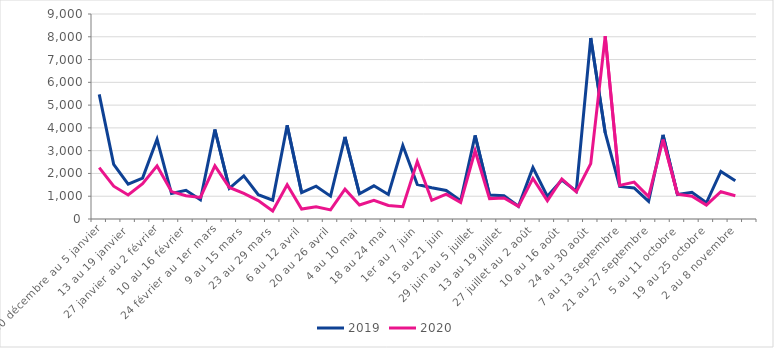
| Category | 2019 | 2020 |
|---|---|---|
| 30 décembre au 5 janvier | 5469 | 2256 |
| 6 au 12 janvier | 2401 | 1441 |
| 13 au 19 janvier | 1528 | 1054 |
| 20 au 26 janvier | 1797 | 1554 |
| 27 janvier au 2 février | 3500 | 2331 |
| 3 au 9 février | 1116 | 1204 |
| 10 au 16 février | 1260 | 1022 |
| 17 au 23 février | 842 | 948 |
| 24 février au 1er mars | 3929 | 2335 |
| 2 au 8 mars | 1349 | 1386 |
| 9 au 15 mars | 1894 | 1122 |
| 16 au 22 mars | 1068 | 810 |
| 23 au 29 mars | 828 | 352 |
| 30 mars au 5 avril | 4112 | 1501 |
| 6 au 12 avril | 1157 | 438 |
| 13 au 19 avril | 1441 | 540 |
| 20 au 26 avril | 1004 | 399 |
| 27 avril au 3 mai | 3605 | 1312 |
| 4 au 10 mai | 1107 | 617 |
| 11 au 17 mai | 1456 | 817 |
| 18 au 24 mai | 1077 | 597 |
| 25 au 31 mai | 3223 | 539 |
| 1er au 7 juin | 1515 | 2523 |
| 8 au 14 juin | 1371 | 819 |
| 15 au 21 juin | 1250 | 1088 |
| 22 au 28 juin | 799 | 721 |
| 29 juin au 5 juillet | 3668 | 2997 |
| 6 au 12 juillet | 1051 | 895 |
| 13 au 19 juillet | 1026 | 925 |
| 20 au 26 juillet | 558 | 555 |
| 27 juillet au 2 août | 2262 | 1782 |
| 3 au 9 août | 995 | 805 |
| 10 au 16 août | 1713 | 1757 |
| 17 au 23 août | 1221 | 1194 |
| 24 au 30 août | 7943 | 2430 |
| 31 août au 6 septembre | 3788 | 8025 |
| 7 au 13 septembre | 1432 | 1471 |
| 14 au 20 septembre | 1366 | 1620 |
| 21 au 27 septembre | 777 | 980 |
| 28 septembre au 4 octobre | 3696 | 3481 |
| 5 au 11 octobre | 1071 | 1092 |
| 12 au 18 octobre | 1171 | 1001 |
| 19 au 25 octobre | 711 | 611 |
| 26 octobre au 1er novembre | 2090 | 1197 |
| 2 au 8 novembre | 1678 | 1022 |